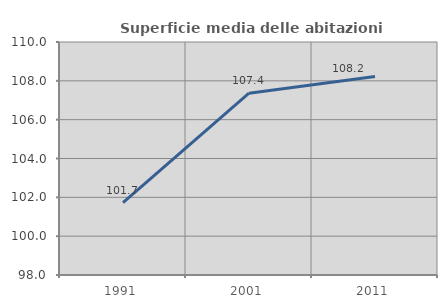
| Category | Superficie media delle abitazioni occupate |
|---|---|
| 1991.0 | 101.723 |
| 2001.0 | 107.362 |
| 2011.0 | 108.223 |